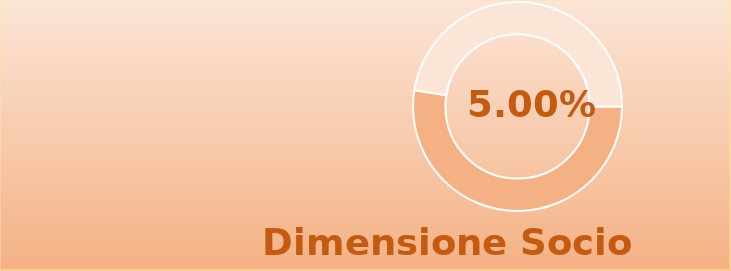
| Category | Series 0 |
|---|---|
| 0 | 1.05 |
| 1 | 0.95 |